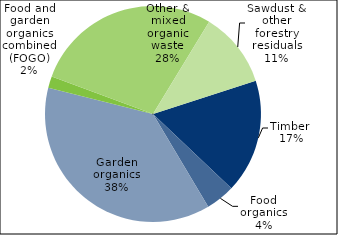
| Category | Series 0 |
|---|---|
| Timber  | 187632 |
| Food organics | 47978 |
| Garden organics | 411456 |
| Food and garden organics combined (FOGO) | 18970 |
| Other & mixed organic waste | 308141 |
| Sawdust & other forestry residuals | 124028 |